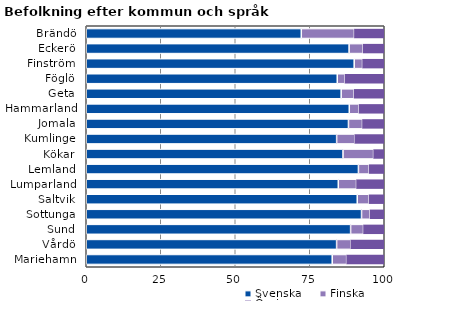
| Category | Svenska | Finska | Övriga |
|---|---|---|---|
| Brändö | 72.16 | 17.817 | 10.022 |
| Eckerö | 88.21 | 4.716 | 7.074 |
| Finström | 89.917 | 2.805 | 7.278 |
| Föglö | 84.232 | 2.595 | 13.174 |
| Geta | 85.545 | 4.356 | 10.099 |
| Hammarland | 88.264 | 3.274 | 8.462 |
| Jomala | 87.99 | 4.699 | 7.311 |
| Kumlinge | 84.026 | 6.07 | 9.904 |
| Kökar | 86.161 | 10.268 | 3.571 |
| Lemland | 91.335 | 3.607 | 5.059 |
| Lumparland | 84.574 | 6.117 | 9.309 |
| Saltvik | 90.939 | 3.978 | 5.083 |
| Sottunga | 92.381 | 2.857 | 4.762 |
| Sund | 88.714 | 4.318 | 6.968 |
| Vårdö | 84.017 | 4.752 | 11.231 |
| Mariehamn | 82.541 | 4.846 | 12.613 |